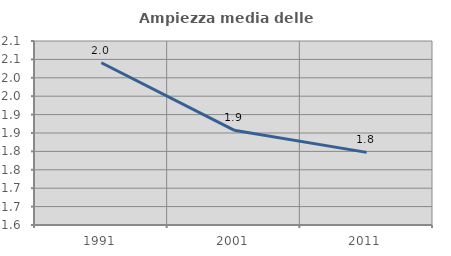
| Category | Ampiezza media delle famiglie |
|---|---|
| 1991.0 | 2.041 |
| 2001.0 | 1.858 |
| 2011.0 | 1.797 |